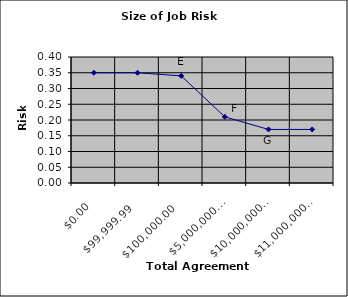
| Category | Risk |
|---|---|
| 0.0 | 0.35 |
| 99999.99 | 0.35 |
| 100000.0 | 0.34 |
| 5000000.0 | 0.21 |
| 10000000.0 | 0.17 |
| 11000000.0 | 0.17 |